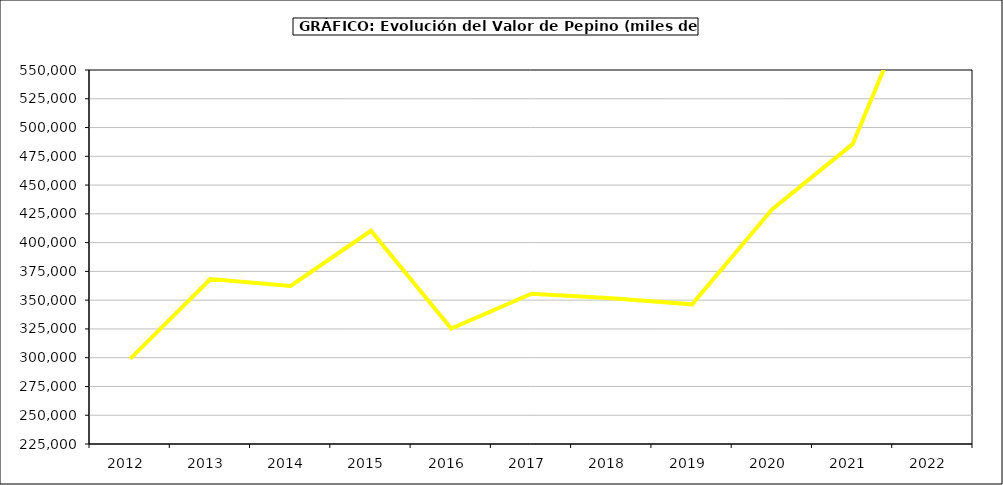
| Category | Valor |
|---|---|
| 2012.0 | 298950.9 |
| 2013.0 | 368300.179 |
| 2014.0 | 362347 |
| 2015.0 | 410299 |
| 2016.0 | 325360 |
| 2017.0 | 355598.015 |
| 2018.0 | 351610.152 |
| 2019.0 | 346372.719 |
| 2020.0 | 429148.693 |
| 2021.0 | 485555.511 |
| 2022.0 | 652802.45 |